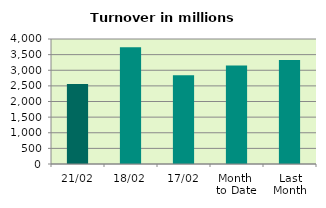
| Category | Series 0 |
|---|---|
| 21/02 | 2559.154 |
| 18/02 | 3738.369 |
| 17/02 | 2841.974 |
| Month 
to Date | 3152.776 |
| Last
Month | 3330.335 |